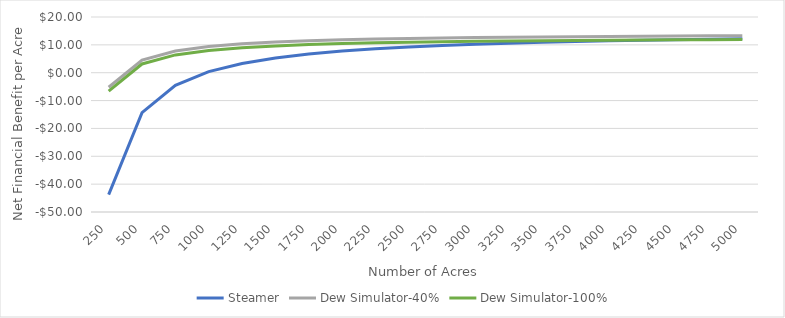
| Category | Steamer | Dew Simulator-40% | Dew Simulator-100% |
|---|---|---|---|
| 250.0 | -43.779 | -5.226 | -6.6 |
| 500.0 | -14.332 | 4.513 | 3.139 |
| 750.0 | -4.517 | 7.76 | 6.386 |
| 1000.0 | 0.391 | 9.383 | 8.009 |
| 1250.0 | 3.336 | 10.357 | 8.983 |
| 1500.0 | 5.299 | 11.006 | 9.632 |
| 1750.0 | 6.701 | 11.47 | 10.096 |
| 2000.0 | 7.753 | 11.818 | 10.444 |
| 2250.0 | 8.571 | 12.088 | 10.714 |
| 2500.0 | 9.225 | 12.305 | 10.931 |
| 2750.0 | 9.761 | 12.482 | 11.108 |
| 3000.0 | 10.207 | 12.629 | 11.255 |
| 3250.0 | 10.584 | 12.754 | 11.38 |
| 3500.0 | 10.908 | 12.861 | 11.487 |
| 3750.0 | 11.188 | 12.954 | 11.58 |
| 4000.0 | 11.434 | 13.035 | 11.661 |
| 4250.0 | 11.65 | 13.107 | 11.733 |
| 4500.0 | 11.843 | 13.17 | 11.796 |
| 4750.0 | 12.015 | 13.227 | 11.853 |
| 5000.0 | 12.17 | 13.278 | 11.904 |